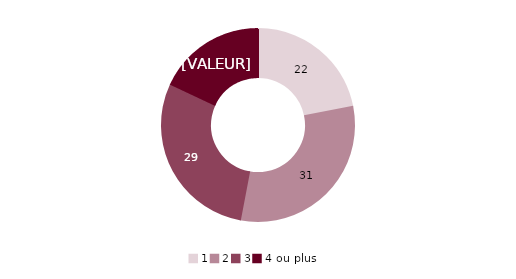
| Category | Series 0 |
|---|---|
| 1 | 22 |
| 2 | 31 |
| 3 | 29 |
| 4 ou plus | 18 |